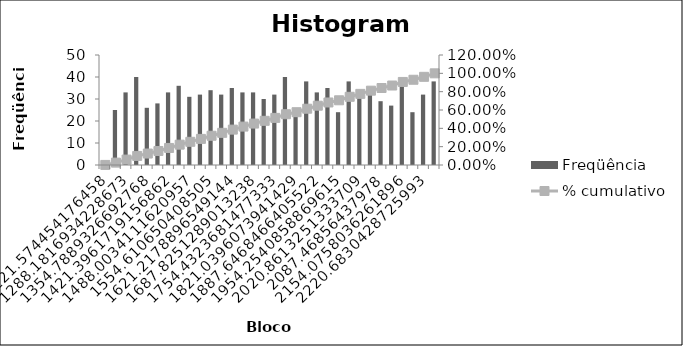
| Category | Freqüência |
|---|---|
| 1221,57 | 1 |
| 1254,88 | 25 |
| 1288,18 | 33 |
| 1321,49 | 40 |
| 1354,79 | 26 |
| 1388,09 | 28 |
| 1421,40 | 33 |
| 1454,70 | 36 |
| 1488,00 | 31 |
| 1521,31 | 32 |
| 1554,61 | 34 |
| 1587,91 | 32 |
| 1621,22 | 35 |
| 1654,52 | 33 |
| 1687,83 | 33 |
| 1721,13 | 30 |
| 1754,43 | 32 |
| 1787,74 | 40 |
| 1821,04 | 22 |
| 1854,34 | 38 |
| 1887,65 | 33 |
| 1920,95 | 35 |
| 1954,25 | 24 |
| 1987,56 | 38 |
| 2020,86 | 32 |
| 2054,16 | 35 |
| 2087,47 | 29 |
| 2120,77 | 27 |
| 2154,08 | 39 |
| 2187,38 | 24 |
| 2220,68 | 32 |
| Mais | 38 |